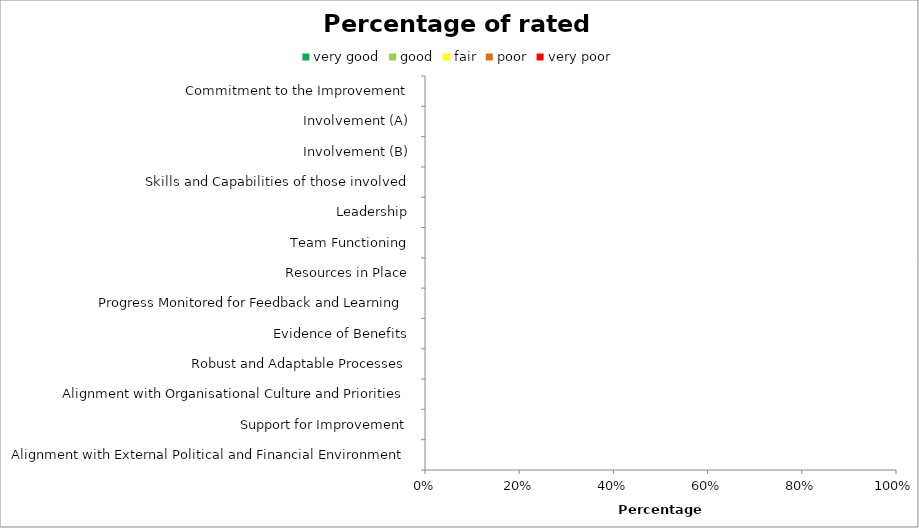
| Category | very good | good | fair | poor | very poor |
|---|---|---|---|---|---|
| Commitment to the Improvement | 0 | 0 | 0 | 0 | 0 |
| Involvement (A) | 0 | 0 | 0 | 0 | 0 |
| Involvement (B) | 0 | 0 | 0 | 0 | 0 |
| Skills and Capabilities of those involved | 0 | 0 | 0 | 0 | 0 |
| Leadership | 0 | 0 | 0 | 0 | 0 |
| Team Functioning | 0 | 0 | 0 | 0 | 0 |
| Resources in Place | 0 | 0 | 0 | 0 | 0 |
| Progress Monitored for Feedback and Learning | 0 | 0 | 0 | 0 | 0 |
| Evidence of Benefits | 0 | 0 | 0 | 0 | 0 |
| Robust and Adaptable Processes | 0 | 0 | 0 | 0 | 0 |
| Alignment with Organisational Culture and Priorities | 0 | 0 | 0 | 0 | 0 |
| Support for Improvement | 0 | 0 | 0 | 0 | 0 |
| Alignment with External Political and Financial Environment | 0 | 0 | 0 | 0 | 0 |